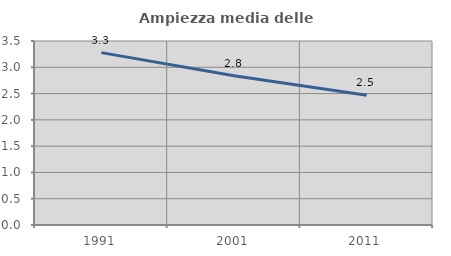
| Category | Ampiezza media delle famiglie |
|---|---|
| 1991.0 | 3.279 |
| 2001.0 | 2.838 |
| 2011.0 | 2.47 |